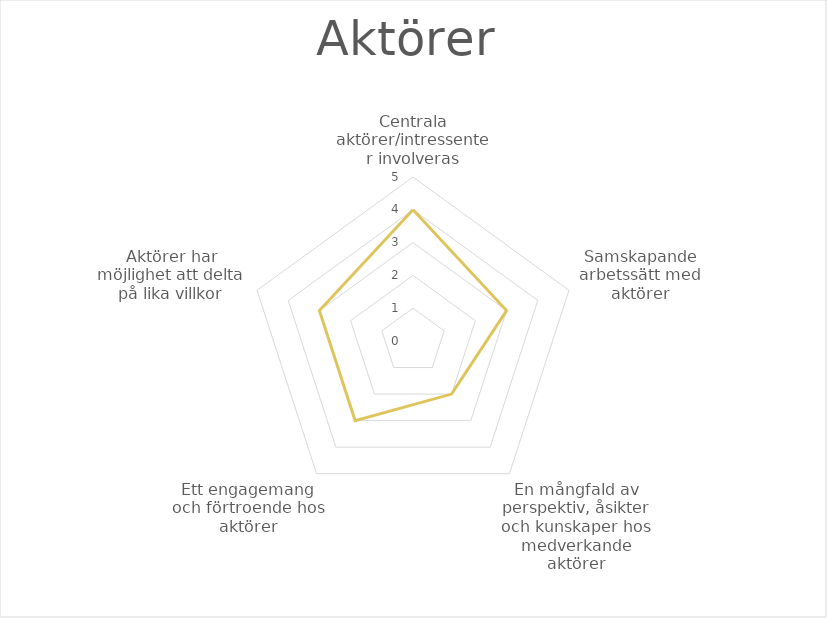
| Category | Aktörer |
|---|---|
| Centrala aktörer/intressenter involveras | 4 |
| Samskapande arbetssätt med aktörer | 3 |
| En mångfald av perspektiv, åsikter och kunskaper hos medverkande aktörer | 2 |
| Ett engagemang och förtroende hos aktörer | 3 |
| Aktörer har möjlighet att delta på lika villkor | 3 |